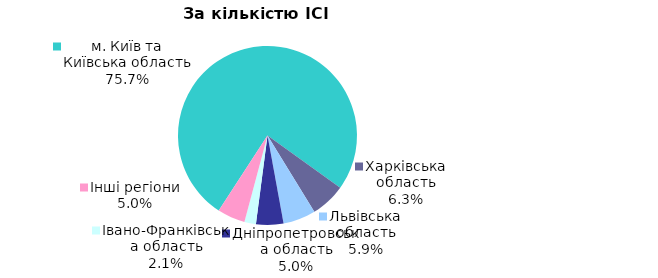
| Category | Series 0 |
|---|---|
| м. Київ та Київська область | 0.757 |
| Харківська область | 0.063 |
| Львівська область | 0.059 |
| Дніпропетровська область | 0.05 |
| Iвано-Франкiвська область | 0.021 |
| Інші регіони | 0.05 |